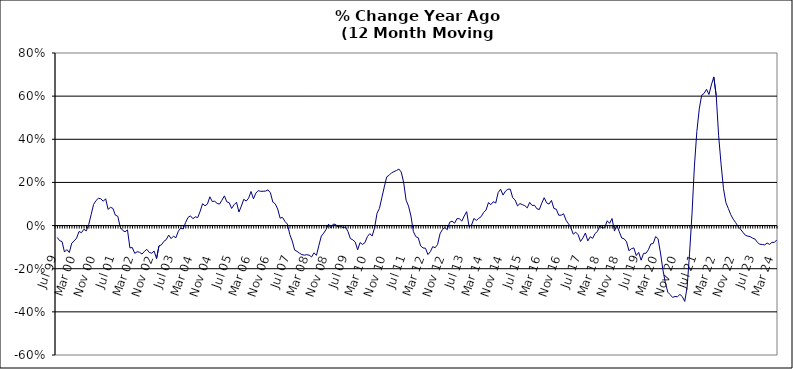
| Category | Series 0 |
|---|---|
| Jul 99 | -0.055 |
| Aug 99 | -0.07 |
| Sep 99 | -0.074 |
| Oct 99 | -0.123 |
| Nov 99 | -0.111 |
| Dec 99 | -0.125 |
| Jan 00 | -0.082 |
| Feb 00 | -0.071 |
| Mar 00 | -0.058 |
| Apr 00 | -0.027 |
| May 00 | -0.033 |
| Jun 00 | -0.017 |
| Jul 00 | -0.025 |
| Aug 00 | 0.005 |
| Sep 00 | 0.05 |
| Oct 00 | 0.098 |
| Nov 00 | 0.116 |
| Dec 00 | 0.127 |
| Jan 01 | 0.124 |
| Feb 01 | 0.113 |
| Mar 01 | 0.124 |
| Apr 01 | 0.075 |
| May 01 | 0.085 |
| Jun 01 | 0.08 |
| Jul 01 | 0.048 |
| Aug 01 | 0.043 |
| Sep 01 | -0.007 |
| Oct 01 | -0.022 |
| Nov 01 | -0.029 |
| Dec 01 | -0.02 |
| Jan 02 | -0.103 |
| Feb 02 | -0.102 |
| Mar 02 | -0.129 |
| Apr 02 | -0.121 |
| May 02 | -0.124 |
| Jun 02 | -0.132 |
| Jul 02 | -0.119 |
| Aug 02 | -0.11 |
| Sep 02 | -0.125 |
| Oct 02 | -0.128 |
| Nov 02 | -0.118 |
| Dec 02 | -0.153 |
| Jan 03 | -0.094 |
| Feb 03 | -0.09 |
| Mar 03 | -0.073 |
| Apr 03 | -0.065 |
| May 03 | -0.044 |
| Jun 03 | -0.06 |
| Jul 03 | -0.049 |
| Aug 03 | -0.056 |
| Sep 03 | -0.026 |
| Oct 03 | -0.012 |
| Nov 03 | -0.016 |
| Dec 03 | 0.014 |
| Jan 04 | 0.038 |
| Feb 04 | 0.045 |
| Mar 04 | 0.032 |
| Apr 04 | 0.041 |
| May 04 | 0.037 |
| Jun 04 | 0.066 |
| Jul 04 | 0.101 |
| Aug 04 | 0.092 |
| Sep 04 | 0.1 |
| Oct 04 | 0.133 |
| Nov 04 | 0.111 |
| Dec 04 | 0.113 |
| Jan 05 | 0.103 |
| Feb 05 | 0.1 |
| Mar 05 | 0.118 |
| Apr 05 | 0.138 |
| May 05 | 0.11 |
| Jun 05 | 0.106 |
| Jul 05 | 0.079 |
| Aug 05 | 0.097 |
| Sep 05 | 0.108 |
| Oct 05 | 0.063 |
| Nov 05 | 0.09 |
| Dec 05 | 0.122 |
| Jan 06 | 0.114 |
| Feb 06 | 0.127 |
| Mar 06 | 0.158 |
| Apr 06 | 0.124 |
| May 06 | 0.151 |
| Jun 06 | 0.162 |
| Jul 06 | 0.159 |
| Aug 06 | 0.159 |
| Sep 06 | 0.16 |
| Oct 06 | 0.166 |
| Nov 06 | 0.152 |
| Dec 06 | 0.109 |
| Jan 07 | 0.101 |
| Feb 07 | 0.076 |
| Mar 07 | 0.034 |
| Apr 07 | 0.038 |
| May 07 | 0.019 |
| Jun 07 | 0.007 |
| Jul 07 | -0.041 |
| Aug 07 | -0.071 |
| Sep 07 | -0.113 |
| Oct 07 | -0.12 |
| Nov 07 | -0.128 |
| Dec 07 | -0.135 |
| Jan 08 | -0.137 |
| Feb 08 | -0.135 |
| Mar 08 | -0.137 |
| Apr 08 | -0.145 |
| May 08 | -0.126 |
| Jun 08 | -0.138 |
| Jul 08 | -0.093 |
| Aug 08 | -0.049 |
| Sep-08 | -0.035 |
| Oct 08 | -0.018 |
| Nov 08 | 0.007 |
| Dec 08 | -0.011 |
| Jan 09 | 0.007 |
| Feb 09 | 0.005 |
| Mar 09 | -0.009 |
| Apr 09 | -0.003 |
| May 09 | -0.01 |
| Jun 09 | -0.007 |
| Jul 09 | -0.027 |
| Aug 09 | -0.06 |
| Sep 09 | -0.066 |
| Oct 09 | -0.076 |
| Nov 09 | -0.112 |
| Dec 09 | -0.079 |
| Jan 10 | -0.087 |
| Feb 10 | -0.079 |
| Mar 10 | -0.052 |
| Apr 10 | -0.037 |
| May 10 | -0.048 |
| Jun 10 | -0.01 |
| Jul 10 | 0.057 |
| Aug 10 | 0.08 |
| Sep 10 | 0.13 |
| Oct 10 | 0.179 |
| Nov 10 | 0.226 |
| Dec 10 | 0.233 |
| Jan 11 | 0.245 |
| Feb 11 | 0.25 |
| Mar 11 | 0.255 |
| Apr 11 | 0.262 |
| May 11 | 0.248 |
| Jun 11 | 0.199 |
| Jul 11 | 0.118 |
| Aug 11 | 0.09 |
| Sep 11 | 0.044 |
| Oct 11 | -0.028 |
| Nov 11 | -0.051 |
| Dec 11 | -0.056 |
| Jan 12 | -0.094 |
| Feb 12 | -0.104 |
| Mar 12 | -0.105 |
| Apr 12 | -0.134 |
| May 12 | -0.121 |
| Jun 12 | -0.098 |
| Jul 12 | -0.103 |
| Aug 12 | -0.087 |
| Sep 12 | -0.038 |
| Oct 12 | -0.018 |
| Nov 12 | -0.009 |
| Dec 12 | -0.019 |
| Jan 13 | 0.016 |
| Feb-13 | 0.02 |
| Mar-13 | 0.011 |
| Apr 13 | 0.032 |
| May 13 | 0.032 |
| Jun-13 | 0.021 |
| Jul 13 | 0.045 |
| Aug 13 | 0.065 |
| Sep 13 | -0.005 |
| Oct 13 | 0.002 |
| Nov 13 | 0.033 |
| Dec 13 | 0.024 |
| Jan 14 | 0.034 |
| Feb-14 | 0.042 |
| Mar 14 | 0.061 |
| Apr 14 | 0.072 |
| May 14 | 0.107 |
| Jun 14 | 0.097 |
| Jul-14 | 0.111 |
| Aug-14 | 0.105 |
| Sep 14 | 0.153 |
| Oct 14 | 0.169 |
| Nov 14 | 0.141 |
| Dec 14 | 0.159 |
| Jan 15 | 0.169 |
| Feb 15 | 0.169 |
| Mar 15 | 0.129 |
| Apr-15 | 0.118 |
| May 15 | 0.091 |
| Jun-15 | 0.102 |
| Jul 15 | 0.097 |
| Aug 15 | 0.092 |
| Sep 15 | 0.082 |
| Oct 15 | 0.108 |
| Nov 15 | 0.093 |
| Dec 15 | 0.094 |
| Jan 16 | 0.078 |
| Feb 16 | 0.075 |
| Mar 16 | 0.104 |
| Apr 16 | 0.129 |
| May 16 | 0.105 |
| Jun 16 | 0.1 |
| Jul 16 | 0.117 |
| Aug 16 | 0.08 |
| Sep 16 | 0.076 |
| Oct 16 | 0.048 |
| Nov 16 | 0.048 |
| Dec 16 | 0.055 |
| Jan 17 | 0.025 |
| Feb 17 | 0.009 |
| Mar 17 | -0.01 |
| Apr 17 | -0.04 |
| May 17 | -0.031 |
| Jun 17 | -0.042 |
| Jul 17 | -0.074 |
| Aug 17 | -0.057 |
| Sep 17 | -0.035 |
| Oct 17 | -0.071 |
| Nov 17 | -0.052 |
| Dec 17 | -0.059 |
| Jan 18 | -0.037 |
| Feb 18 | -0.027 |
| Mar 18 | 0 |
| Apr 18 | -0.012 |
| May 18 | -0.009 |
| Jun 18 | 0.022 |
| Jul 18 | 0.01 |
| Aug 18 | 0.033 |
| Sep 18 | -0.025 |
| Oct 18 | 0.002 |
| Nov 18 | -0.029 |
| Dec 18 | -0.058 |
| Jan 19 | -0.061 |
| Feb 19 | -0.075 |
| Mar 19 | -0.117 |
| Apr 19 | -0.107 |
| May 19 | -0.104 |
| Jun 19 | -0.139 |
| Jul 19 | -0.124 |
| Aug 19 | -0.16 |
| Sep 19 | -0.129 |
| Oct 19 | -0.128 |
| Nov 19 | -0.112 |
| Dec 19 | -0.085 |
| Jan 20 | -0.083 |
| Feb 20 | -0.051 |
| Mar 20 | -0.061 |
| Apr 20 | -0.127 |
| May 20 | -0.206 |
| Jun 20 | -0.264 |
| Jul 20 | -0.308 |
| Aug 20 | -0.32 |
| Sep 20 | -0.333 |
| Oct 20 | -0.329 |
| Nov 20 | -0.33 |
| Dec 20 | -0.319 |
| Jan 21 | -0.329 |
| Feb 21 | -0.352 |
| Mar 21 | -0.286 |
| Apr 21 | -0.129 |
| May 21 | 0.053 |
| Jun 21 | 0.276 |
| Jul 21 | 0.435 |
| Aug 21 | 0.541 |
| Sep 21 | 0.604 |
| Oct 21 | 0.613 |
| Nov 21 | 0.632 |
| Dec 21 | 0.608 |
| Jan 22 | 0.652 |
| Feb 22 | 0.689 |
| Mar 22 | 0.603 |
| Apr 22 | 0.416 |
| May 22 | 0.285 |
| Jun 22 | 0.171 |
| Jul 22 | 0.106 |
| Aug 22 | 0.079 |
| Sep 22 | 0.051 |
| Oct 22 | 0.03 |
| Nov 22 | 0.014 |
| Dec 22 | -0.004 |
| Jan 23 | -0.017 |
| Feb 23 | -0.031 |
| Mar 23 | -0.045 |
| Apr 23 | -0.049 |
| May 23 | -0.051 |
| Jun 23 | -0.058 |
| Jul 23 | -0.062 |
| Aug 23 | -0.078 |
| Sep 23 | -0.087 |
| Oct 23 | -0.087 |
| Nov 23 | -0.09 |
| Dec 23 | -0.081 |
| Jan 24 | -0.087 |
| Feb 24 | -0.078 |
| Mar 24 | -0.078 |
| Apr 24 | -0.067 |